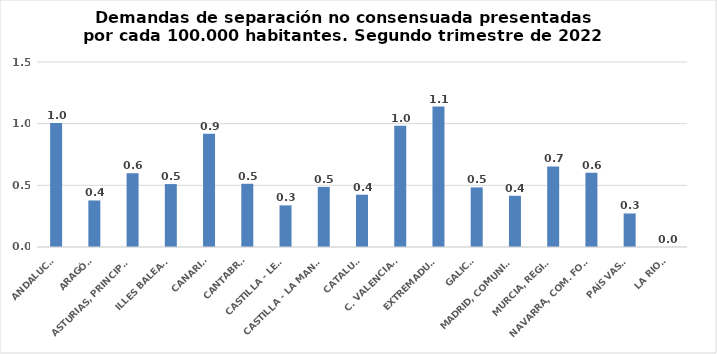
| Category | Series 0 |
|---|---|
| ANDALUCÍA | 1.004 |
| ARAGÓN | 0.377 |
| ASTURIAS, PRINCIPADO | 0.597 |
| ILLES BALEARS | 0.51 |
| CANARIAS | 0.919 |
| CANTABRIA | 0.513 |
| CASTILLA - LEÓN | 0.338 |
| CASTILLA - LA MANCHA | 0.487 |
| CATALUÑA | 0.424 |
| C. VALENCIANA | 0.982 |
| EXTREMADURA | 1.138 |
| GALICIA | 0.483 |
| MADRID, COMUNIDAD | 0.415 |
| MURCIA, REGIÓN | 0.653 |
| NAVARRA, COM. FORAL | 0.603 |
| PAÍS VASCO | 0.272 |
| LA RIOJA | 0 |